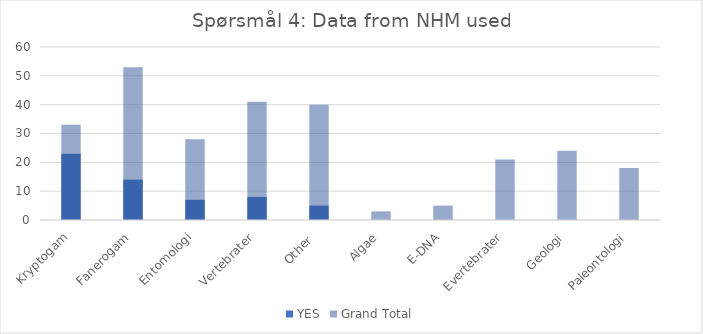
| Category | YES | Grand Total |
|---|---|---|
| Kryptogam | 23 | 33 |
| Fanerogam | 14 | 53 |
| Entomologi | 7 | 28 |
| Vertebrater | 8 | 41 |
| Other  | 5 | 40 |
| Algae | 0 | 3 |
| E-DNA | 0 | 5 |
| Evertebrater | 0 | 21 |
| Geologi | 0 | 24 |
| Paleontologi | 0 | 18 |